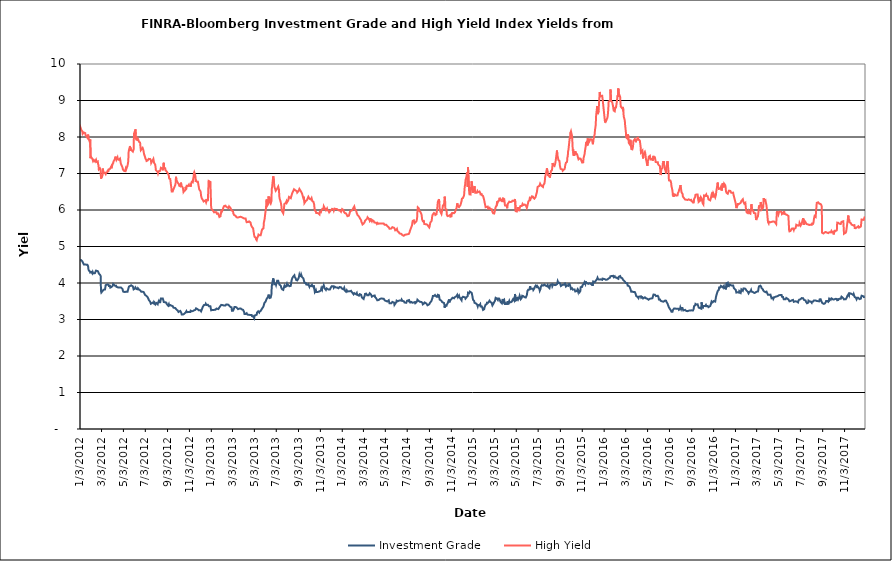
| Category | Investment Grade | High Yield |
|---|---|---|
| 1/3/12 | 4.624 | 8.216 |
| 1/4/12 | 4.644 | 8.259 |
| 1/5/12 | 4.644 | 8.232 |
| 1/6/12 | 4.626 | 8.199 |
| 1/9/12 | 4.59 | 8.152 |
| 1/10/12 | 4.585 | 8.087 |
| 1/11/12 | 4.55 | 8.061 |
| 1/12/12 | 4.527 | 8.108 |
| 1/13/12 | 4.51 | 8.124 |
| 1/17/12 | 4.51 | 8.108 |
| 1/18/12 | 4.485 | 8.052 |
| 1/19/12 | 4.488 | 8.052 |
| 1/20/12 | 4.503 | 8.047 |
| 1/23/12 | 4.499 | 7.982 |
| 1/24/12 | 4.515 | 7.979 |
| 1/25/12 | 4.463 | 8.067 |
| 1/26/12 | 4.377 | 8.005 |
| 1/27/12 | 4.344 | 7.944 |
| 1/30/12 | 4.318 | 7.856 |
| 1/31/12 | 4.288 | 7.93 |
| 2/1/12 | 4.311 | 7.42 |
| 2/2/12 | 4.283 | 7.458 |
| 2/3/12 | 4.302 | 7.45 |
| 2/6/12 | 4.261 | 7.402 |
| 2/7/12 | 4.294 | 7.41 |
| 2/8/12 | 4.264 | 7.338 |
| 2/9/12 | 4.292 | 7.322 |
| 2/10/12 | 4.28 | 7.37 |
| 2/13/12 | 4.27 | 7.333 |
| 2/14/12 | 4.268 | 7.355 |
| 2/15/12 | 4.272 | 7.348 |
| 2/16/12 | 4.34 | 7.377 |
| 2/17/12 | 4.318 | 7.315 |
| 2/21/12 | 4.326 | 7.333 |
| 2/22/12 | 4.307 | 7.259 |
| 2/23/12 | 4.289 | 7.23 |
| 2/24/12 | 4.256 | 7.113 |
| 2/27/12 | 4.227 | 7.141 |
| 2/28/12 | 4.205 | 7.128 |
| 2/29/12 | 4.196 | 7.087 |
| 3/1/12 | 3.782 | 6.859 |
| 3/2/12 | 3.739 | 6.877 |
| 3/5/12 | 3.776 | 6.946 |
| 3/6/12 | 3.792 | 7.137 |
| 3/7/12 | 3.798 | 7.084 |
| 3/8/12 | 3.816 | 7.085 |
| 3/9/12 | 3.829 | 7.01 |
| 3/12/12 | 3.82 | 7.02 |
| 3/13/12 | 3.866 | 7.002 |
| 3/14/12 | 3.94 | 6.987 |
| 3/15/12 | 3.944 | 7.022 |
| 3/16/12 | 3.939 | 7.01 |
| 3/19/12 | 3.961 | 7.042 |
| 3/20/12 | 3.981 | 7.089 |
| 3/21/12 | 3.94 | 7.051 |
| 3/22/12 | 3.95 | 7.109 |
| 3/23/12 | 3.919 | 7.133 |
| 3/26/12 | 3.924 | 7.127 |
| 3/27/12 | 3.874 | 7.107 |
| 3/28/12 | 3.883 | 7.113 |
| 3/29/12 | 3.883 | 7.181 |
| 3/30/12 | 3.888 | 7.142 |
| 4/2/12 | 3.914 | 7.257 |
| 4/3/12 | 3.93 | 7.25 |
| 4/4/12 | 3.973 | 7.286 |
| 4/5/12 | 3.958 | 7.331 |
| 4/9/12 | 3.923 | 7.398 |
| 4/10/12 | 3.915 | 7.462 |
| 4/11/12 | 3.932 | 7.466 |
| 4/12/12 | 3.927 | 7.411 |
| 4/13/12 | 3.896 | 7.375 |
| 4/16/12 | 3.885 | 7.44 |
| 4/17/12 | 3.895 | 7.391 |
| 4/18/12 | 3.887 | 7.378 |
| 4/19/12 | 3.875 | 7.389 |
| 4/20/12 | 3.891 | 7.374 |
| 4/23/12 | 3.88 | 7.407 |
| 4/24/12 | 3.89 | 7.354 |
| 4/25/12 | 3.902 | 7.283 |
| 4/26/12 | 3.877 | 7.261 |
| 4/27/12 | 3.859 | 7.23 |
| 4/30/12 | 3.838 | 7.166 |
| 5/1/12 | 3.79 | 7.111 |
| 5/2/12 | 3.763 | 7.089 |
| 5/3/12 | 3.753 | 7.084 |
| 5/4/12 | 3.741 | 7.073 |
| 5/7/12 | 3.754 | 7.065 |
| 5/8/12 | 3.736 | 7.096 |
| 5/9/12 | 3.758 | 7.133 |
| 5/10/12 | 3.764 | 7.106 |
| 5/11/12 | 3.753 | 7.114 |
| 5/14/12 | 3.761 | 7.218 |
| 5/15/12 | 3.777 | 7.243 |
| 5/16/12 | 3.834 | 7.333 |
| 5/17/12 | 3.87 | 7.578 |
| 5/18/12 | 3.902 | 7.646 |
| 5/21/12 | 3.917 | 7.752 |
| 5/22/12 | 3.933 | 7.622 |
| 5/23/12 | 3.918 | 7.682 |
| 5/24/12 | 3.937 | 7.672 |
| 5/25/12 | 3.915 | 7.64 |
| 5/29/12 | 3.905 | 7.602 |
| 5/30/12 | 3.862 | 7.632 |
| 5/31/12 | 3.826 | 7.662 |
| 6/1/12 | 3.818 | 8.092 |
| 6/4/12 | 3.85 | 8.17 |
| 6/5/12 | 3.878 | 8.21 |
| 6/6/12 | 3.886 | 8.066 |
| 6/7/12 | 3.856 | 7.931 |
| 6/8/12 | 3.836 | 7.933 |
| 6/11/12 | 3.828 | 7.914 |
| 6/12/12 | 3.856 | 7.949 |
| 6/13/12 | 3.86 | 7.943 |
| 6/14/12 | 3.863 | 7.942 |
| 6/15/12 | 3.821 | 7.87 |
| 6/18/12 | 3.8 | 7.848 |
| 6/19/12 | 3.803 | 7.732 |
| 6/20/12 | 3.792 | 7.639 |
| 6/21/12 | 3.763 | 7.625 |
| 6/22/12 | 3.773 | 7.65 |
| 6/25/12 | 3.762 | 7.701 |
| 6/26/12 | 3.776 | 7.674 |
| 6/27/12 | 3.768 | 7.646 |
| 6/28/12 | 3.751 | 7.632 |
| 6/29/12 | 3.757 | 7.535 |
| 7/2/12 | 3.673 | 7.447 |
| 7/3/12 | 3.66 | 7.406 |
| 7/5/12 | 3.651 | 7.378 |
| 7/6/12 | 3.629 | 7.342 |
| 7/9/12 | 3.611 | 7.357 |
| 7/10/12 | 3.588 | 7.354 |
| 7/11/12 | 3.572 | 7.34 |
| 7/12/12 | 3.541 | 7.402 |
| 7/13/12 | 3.535 | 7.388 |
| 7/16/12 | 3.487 | 7.396 |
| 7/17/12 | 3.48 | 7.399 |
| 7/18/12 | 3.431 | 7.363 |
| 7/19/12 | 3.418 | 7.288 |
| 7/20/12 | 3.447 | 7.314 |
| 7/23/12 | 3.462 | 7.359 |
| 7/24/12 | 3.448 | 7.378 |
| 7/25/12 | 3.445 | 7.399 |
| 7/26/12 | 3.44 | 7.346 |
| 7/27/12 | 3.483 | 7.292 |
| 7/30/12 | 3.45 | 7.246 |
| 7/31/12 | 3.416 | 7.184 |
| 8/1/12 | 3.428 | 7.092 |
| 8/2/12 | 3.414 | 7.106 |
| 8/3/12 | 3.45 | 7.088 |
| 8/6/12 | 3.418 | 7.041 |
| 8/7/12 | 3.461 | 7.003 |
| 8/8/12 | 3.479 | 7.034 |
| 8/9/12 | 3.504 | 7.035 |
| 8/10/12 | 3.473 | 7.07 |
| 8/13/12 | 3.471 | 7.073 |
| 8/14/12 | 3.518 | 7.074 |
| 8/15/12 | 3.575 | 7.155 |
| 8/16/12 | 3.592 | 7.161 |
| 8/17/12 | 3.585 | 7.148 |
| 8/20/12 | 3.578 | 7.123 |
| 8/21/12 | 3.57 | 7.089 |
| 8/22/12 | 3.519 | 7.077 |
| 8/23/12 | 3.479 | 7.292 |
| 8/24/12 | 3.488 | 7.141 |
| 8/27/12 | 3.472 | 7.141 |
| 8/28/12 | 3.462 | 7.084 |
| 8/29/12 | 3.479 | 7.101 |
| 8/30/12 | 3.462 | 7.07 |
| 8/31/12 | 3.429 | 7.058 |
| 9/4/12 | 3.381 | 6.991 |
| 9/5/12 | 3.393 | 6.999 |
| 9/6/12 | 3.42 | 6.945 |
| 9/7/12 | 3.379 | 6.864 |
| 9/10/12 | 3.397 | 6.85 |
| 9/11/12 | 3.389 | 6.773 |
| 9/12/12 | 3.394 | 6.683 |
| 9/13/12 | 3.38 | 6.624 |
| 9/14/12 | 3.386 | 6.506 |
| 9/17/12 | 3.365 | 6.507 |
| 9/18/12 | 3.349 | 6.545 |
| 9/19/12 | 3.325 | 6.538 |
| 9/20/12 | 3.34 | 6.588 |
| 9/21/12 | 3.334 | 6.594 |
| 9/24/12 | 3.314 | 6.685 |
| 9/25/12 | 3.315 | 6.734 |
| 9/26/12 | 3.304 | 6.91 |
| 9/27/12 | 3.28 | 6.846 |
| 9/28/12 | 3.261 | 6.81 |
| 10/1/12 | 3.242 | 6.745 |
| 10/2/12 | 3.225 | 6.758 |
| 10/3/12 | 3.206 | 6.729 |
| 10/4/12 | 3.198 | 6.708 |
| 10/5/12 | 3.217 | 6.665 |
| 10/8/12 | 3.234 | 6.651 |
| 10/9/12 | 3.211 | 6.699 |
| 10/10/12 | 3.215 | 6.75 |
| 10/11/12 | 3.18 | 6.673 |
| 10/12/12 | 3.137 | 6.659 |
| 10/15/12 | 3.135 | 6.614 |
| 10/16/12 | 3.134 | 6.56 |
| 10/17/12 | 3.131 | 6.493 |
| 10/18/12 | 3.149 | 6.482 |
| 10/19/12 | 3.16 | 6.522 |
| 10/22/12 | 3.183 | 6.536 |
| 10/23/12 | 3.201 | 6.636 |
| 10/24/12 | 3.205 | 6.564 |
| 10/25/12 | 3.228 | 6.597 |
| 10/26/12 | 3.2 | 6.662 |
| 10/29/12 | 3.203 | 6.656 |
| 10/30/12 | 3.206 | 6.657 |
| 10/31/12 | 3.18 | 6.676 |
| 11/1/12 | 3.205 | 6.697 |
| 11/2/12 | 3.215 | 6.665 |
| 11/5/12 | 3.207 | 6.673 |
| 11/6/12 | 3.241 | 6.638 |
| 11/7/12 | 3.226 | 6.716 |
| 11/8/12 | 3.223 | 6.722 |
| 11/9/12 | 3.226 | 6.772 |
| 11/12/12 | 3.231 | 6.76 |
| 11/13/12 | 3.234 | 6.859 |
| 11/14/12 | 3.234 | 6.896 |
| 11/15/12 | 3.248 | 7.004 |
| 11/16/12 | 3.256 | 7.034 |
| 11/19/12 | 3.264 | 6.942 |
| 11/20/12 | 3.279 | 6.776 |
| 11/21/12 | 3.306 | 6.812 |
| 11/23/12 | 3.3 | 6.777 |
| 11/26/12 | 3.276 | 6.775 |
| 11/27/12 | 3.269 | 6.718 |
| 11/28/12 | 3.258 | 6.697 |
| 11/29/12 | 3.25 | 6.607 |
| 11/30/12 | 3.244 | 6.561 |
| 12/3/12 | 3.252 | 6.521 |
| 12/4/12 | 3.247 | 6.486 |
| 12/5/12 | 3.223 | 6.392 |
| 12/6/12 | 3.219 | 6.372 |
| 12/7/12 | 3.243 | 6.317 |
| 12/10/12 | 3.35 | 6.272 |
| 12/11/12 | 3.362 | 6.245 |
| 12/12/12 | 3.371 | 6.232 |
| 12/13/12 | 3.396 | 6.227 |
| 12/14/12 | 3.383 | 6.224 |
| 12/17/12 | 3.403 | 6.265 |
| 12/18/12 | 3.431 | 6.248 |
| 12/19/12 | 3.404 | 6.208 |
| 12/20/12 | 3.399 | 6.227 |
| 12/21/12 | 3.382 | 6.275 |
| 12/24/12 | 3.403 | 6.269 |
| 12/26/12 | 3.377 | 6.796 |
| 12/27/12 | 3.36 | 6.778 |
| 12/28/12 | 3.343 | 6.772 |
| 12/31/12 | 3.362 | 6.769 |
| 1/2/13 | 3.253 | 6.097 |
| 1/3/13 | 3.262 | 6.031 |
| 1/4/13 | 3.275 | 6.009 |
| 1/7/13 | 3.263 | 5.989 |
| 1/8/13 | 3.254 | 5.982 |
| 1/9/13 | 3.254 | 5.981 |
| 1/10/13 | 3.263 | 5.936 |
| 1/11/13 | 3.269 | 5.922 |
| 1/14/13 | 3.266 | 5.942 |
| 1/15/13 | 3.27 | 5.969 |
| 1/16/13 | 3.27 | 5.969 |
| 1/17/13 | 3.3 | 5.937 |
| 1/18/13 | 3.291 | 5.899 |
| 1/22/13 | 3.284 | 5.903 |
| 1/23/13 | 3.277 | 5.86 |
| 1/24/13 | 3.294 | 5.846 |
| 1/25/13 | 3.332 | 5.809 |
| 1/28/13 | 3.372 | 5.827 |
| 1/29/13 | 3.379 | 5.889 |
| 1/30/13 | 3.401 | 5.942 |
| 1/31/13 | 3.394 | 6.003 |
| 2/1/13 | 3.393 | 5.96 |
| 2/4/13 | 3.392 | 6.024 |
| 2/5/13 | 3.412 | 6.065 |
| 2/6/13 | 3.397 | 6.086 |
| 2/7/13 | 3.382 | 6.107 |
| 2/8/13 | 3.395 | 6.111 |
| 2/11/13 | 3.385 | 6.118 |
| 2/12/13 | 3.399 | 6.096 |
| 2/13/13 | 3.412 | 6.09 |
| 2/14/13 | 3.398 | 6.075 |
| 2/15/13 | 3.402 | 6.08 |
| 2/19/13 | 3.405 | 6.055 |
| 2/20/13 | 3.406 | 6.039 |
| 2/21/13 | 3.382 | 6.101 |
| 2/22/13 | 3.373 | 6.085 |
| 2/25/13 | 3.342 | 6.054 |
| 2/26/13 | 3.328 | 6.07 |
| 2/27/13 | 3.332 | 6.052 |
| 2/28/13 | 3.335 | 5.988 |
| 3/1/13 | 3.239 | 5.98 |
| 3/4/13 | 3.242 | 5.966 |
| 3/5/13 | 3.255 | 5.902 |
| 3/6/13 | 3.279 | 5.894 |
| 3/7/13 | 3.308 | 5.863 |
| 3/8/13 | 3.345 | 5.861 |
| 3/11/13 | 3.345 | 5.841 |
| 3/12/13 | 3.32 | 5.826 |
| 3/13/13 | 3.327 | 5.822 |
| 3/14/13 | 3.328 | 5.799 |
| 3/15/13 | 3.305 | 5.794 |
| 3/18/13 | 3.284 | 5.795 |
| 3/19/13 | 3.26 | 5.788 |
| 3/20/13 | 3.291 | 5.81 |
| 3/21/13 | 3.296 | 5.805 |
| 3/22/13 | 3.302 | 5.8 |
| 3/25/13 | 3.303 | 5.814 |
| 3/26/13 | 3.312 | 5.815 |
| 3/27/13 | 3.283 | 5.806 |
| 3/28/13 | 3.28 | 5.806 |
| 4/1/13 | 3.264 | 5.782 |
| 4/2/13 | 3.274 | 5.776 |
| 4/3/13 | 3.242 | 5.781 |
| 4/4/13 | 3.202 | 5.769 |
| 4/5/13 | 3.149 | 5.775 |
| 4/8/13 | 3.151 | 5.769 |
| 4/9/13 | 3.146 | 5.733 |
| 4/10/13 | 3.17 | 5.712 |
| 4/11/13 | 3.172 | 5.667 |
| 4/12/13 | 3.142 | 5.651 |
| 4/15/13 | 3.128 | 5.669 |
| 4/16/13 | 3.134 | 5.653 |
| 4/17/13 | 3.128 | 5.675 |
| 4/18/13 | 3.127 | 5.689 |
| 4/19/13 | 3.135 | 5.67 |
| 4/22/13 | 3.126 | 5.653 |
| 4/23/13 | 3.117 | 5.6 |
| 4/24/13 | 3.105 | 5.569 |
| 4/25/13 | 3.125 | 5.572 |
| 4/26/13 | 3.092 | 5.534 |
| 4/29/13 | 3.087 | 5.499 |
| 4/30/13 | 3.086 | 5.43 |
| 5/1/13 | 3.067 | 5.368 |
| 5/2/13 | 3.036 | 5.305 |
| 5/3/13 | 3.109 | 5.266 |
| 5/6/13 | 3.117 | 5.244 |
| 5/7/13 | 3.136 | 5.201 |
| 5/8/13 | 3.129 | 5.184 |
| 5/9/13 | 3.131 | 5.173 |
| 5/10/13 | 3.19 | 5.221 |
| 5/13/13 | 3.224 | 5.288 |
| 5/14/13 | 3.228 | 5.326 |
| 5/15/13 | 3.223 | 5.334 |
| 5/16/13 | 3.19 | 5.306 |
| 5/17/13 | 3.218 | 5.305 |
| 5/20/13 | 3.234 | 5.306 |
| 5/21/13 | 3.229 | 5.314 |
| 5/22/13 | 3.258 | 5.327 |
| 5/23/13 | 3.284 | 5.429 |
| 5/24/13 | 3.284 | 5.465 |
| 5/28/13 | 3.36 | 5.504 |
| 5/29/13 | 3.404 | 5.657 |
| 5/30/13 | 3.413 | 5.675 |
| 5/31/13 | 3.463 | 5.748 |
| 6/3/13 | 3.494 | 5.995 |
| 6/4/13 | 3.522 | 6.063 |
| 6/5/13 | 3.552 | 6.239 |
| 6/6/13 | 3.551 | 6.291 |
| 6/7/13 | 3.57 | 6.113 |
| 6/10/13 | 3.628 | 6.164 |
| 6/11/13 | 3.681 | 6.371 |
| 6/12/13 | 3.674 | 6.305 |
| 6/13/13 | 3.66 | 6.359 |
| 6/14/13 | 3.588 | 6.227 |
| 6/17/13 | 3.599 | 6.175 |
| 6/18/13 | 3.646 | 6.192 |
| 6/19/13 | 3.69 | 6.237 |
| 6/20/13 | 3.91 | 6.572 |
| 6/21/13 | 3.967 | 6.634 |
| 6/24/13 | 4.127 | 6.924 |
| 6/25/13 | 4.1 | 6.906 |
| 6/26/13 | 4.034 | 6.807 |
| 6/27/13 | 3.965 | 6.661 |
| 6/28/13 | 3.948 | 6.621 |
| 7/1/13 | 3.98 | 6.527 |
| 7/2/13 | 3.946 | 6.515 |
| 7/3/13 | 3.938 | 6.511 |
| 7/5/13 | 4.063 | 6.58 |
| 7/8/13 | 4.062 | 6.64 |
| 7/9/13 | 4.028 | 6.597 |
| 7/10/13 | 4.031 | 6.565 |
| 7/11/13 | 3.96 | 6.376 |
| 7/12/13 | 3.939 | 6.31 |
| 7/15/13 | 3.925 | 6.216 |
| 7/16/13 | 3.898 | 6.158 |
| 7/17/13 | 3.86 | 6.1 |
| 7/18/13 | 3.855 | 5.979 |
| 7/19/13 | 3.825 | 5.96 |
| 7/22/13 | 3.811 | 5.908 |
| 7/23/13 | 3.816 | 5.902 |
| 7/24/13 | 3.884 | 6.035 |
| 7/25/13 | 3.915 | 6.163 |
| 7/26/13 | 3.885 | 6.171 |
| 7/29/13 | 3.902 | 6.194 |
| 7/30/13 | 3.908 | 6.189 |
| 7/31/13 | 3.941 | 6.239 |
| 8/1/13 | 3.969 | 6.199 |
| 8/2/13 | 3.925 | 6.226 |
| 8/5/13 | 3.944 | 6.265 |
| 8/6/13 | 3.953 | 6.313 |
| 8/7/13 | 3.934 | 6.358 |
| 8/8/13 | 3.913 | 6.344 |
| 8/9/13 | 3.916 | 6.347 |
| 8/12/13 | 3.923 | 6.324 |
| 8/13/13 | 4.006 | 6.362 |
| 8/14/13 | 4.018 | 6.359 |
| 8/15/13 | 4.099 | 6.426 |
| 8/16/13 | 4.129 | 6.46 |
| 8/19/13 | 4.18 | 6.522 |
| 8/20/13 | 4.155 | 6.544 |
| 8/21/13 | 4.183 | 6.569 |
| 8/22/13 | 4.211 | 6.583 |
| 8/23/13 | 4.166 | 6.552 |
| 8/26/13 | 4.123 | 6.531 |
| 8/27/13 | 4.082 | 6.547 |
| 8/28/13 | 4.096 | 6.551 |
| 8/29/13 | 4.092 | 6.517 |
| 8/30/13 | 4.071 | 6.478 |
| 9/3/13 | 4.136 | 6.523 |
| 9/4/13 | 4.142 | 6.53 |
| 9/5/13 | 4.228 | 6.578 |
| 9/6/13 | 4.2 | 6.565 |
| 9/9/13 | 4.187 | 6.515 |
| 9/10/13 | 4.229 | 6.522 |
| 9/11/13 | 4.208 | 6.505 |
| 9/12/13 | 4.17 | 6.461 |
| 9/13/13 | 4.184 | 6.455 |
| 9/16/13 | 4.128 | 6.326 |
| 9/17/13 | 4.134 | 6.364 |
| 9/18/13 | 4.104 | 6.315 |
| 9/19/13 | 4.011 | 6.189 |
| 9/20/13 | 4.008 | 6.188 |
| 9/23/13 | 3.998 | 6.249 |
| 9/24/13 | 3.96 | 6.231 |
| 9/25/13 | 3.94 | 6.257 |
| 9/26/13 | 3.957 | 6.271 |
| 9/27/13 | 3.951 | 6.297 |
| 9/30/13 | 3.97 | 6.364 |
| 10/1/13 | 3.942 | 6.375 |
| 10/2/13 | 3.916 | 6.359 |
| 10/3/13 | 3.897 | 6.31 |
| 10/4/13 | 3.925 | 6.295 |
| 10/7/13 | 3.916 | 6.288 |
| 10/8/13 | 3.924 | 6.308 |
| 10/9/13 | 3.938 | 6.326 |
| 10/10/13 | 3.948 | 6.286 |
| 10/11/13 | 3.91 | 6.244 |
| 10/14/13 | 3.897 | 6.226 |
| 10/15/13 | 3.933 | 6.22 |
| 10/16/13 | 3.91 | 6.161 |
| 10/17/13 | 3.823 | 6.063 |
| 10/18/13 | 3.753 | 5.992 |
| 10/21/13 | 3.801 | 5.954 |
| 10/22/13 | 3.751 | 5.916 |
| 10/23/13 | 3.738 | 5.926 |
| 10/24/13 | 3.757 | 5.93 |
| 10/25/13 | 3.752 | 5.918 |
| 10/28/13 | 3.76 | 5.906 |
| 10/29/13 | 3.759 | 5.89 |
| 10/30/13 | 3.742 | 5.891 |
| 10/31/13 | 3.771 | 5.876 |
| 11/1/13 | 3.795 | 5.951 |
| 11/4/13 | 3.796 | 5.939 |
| 11/5/13 | 3.844 | 5.976 |
| 11/6/13 | 3.827 | 5.962 |
| 11/7/13 | 3.813 | 5.955 |
| 11/8/13 | 3.899 | 6.033 |
| 11/11/13 | 3.894 | 6.024 |
| 11/12/13 | 3.936 | 6.103 |
| 11/13/13 | 3.906 | 6.126 |
| 11/14/13 | 3.856 | 6.076 |
| 11/15/13 | 3.848 | 6.045 |
| 11/18/13 | 3.809 | 5.992 |
| 11/19/13 | 3.825 | 6.008 |
| 11/20/13 | 3.853 | 6.015 |
| 11/21/13 | 3.879 | 6.04 |
| 11/22/13 | 3.847 | 5.999 |
| 11/25/13 | 3.821 | 5.98 |
| 11/26/13 | 3.799 | 5.977 |
| 11/27/13 | 3.816 | 5.936 |
| 11/29/13 | 3.822 | 5.927 |
| 12/2/13 | 3.881 | 5.994 |
| 12/3/13 | 3.869 | 5.992 |
| 12/4/13 | 3.91 | 6.015 |
| 12/5/13 | 3.928 | 6.031 |
| 12/6/13 | 3.927 | 6.016 |
| 12/9/13 | 3.91 | 6.018 |
| 12/10/13 | 3.87 | 5.984 |
| 12/11/13 | 3.872 | 5.997 |
| 12/12/13 | 3.9 | 6.039 |
| 12/13/13 | 3.895 | 6.03 |
| 12/16/13 | 3.878 | 6.026 |
| 12/17/13 | 3.858 | 6.027 |
| 12/18/13 | 3.859 | 6.033 |
| 12/19/13 | 3.878 | 6.024 |
| 12/20/13 | 3.856 | 6.016 |
| 12/23/13 | 3.857 | 5.993 |
| 12/24/13 | 3.875 | 5.996 |
| 12/26/13 | 3.89 | 5.991 |
| 12/27/13 | 3.903 | 5.977 |
| 12/30/13 | 3.883 | 5.95 |
| 12/31/13 | 3.873 | 5.948 |
| 1/2/14 | 3.844 | 6.025 |
| 1/3/14 | 3.842 | 6.009 |
| 1/6/14 | 3.825 | 5.995 |
| 1/7/14 | 3.818 | 5.951 |
| 1/8/14 | 3.87 | 5.943 |
| 1/9/14 | 3.864 | 5.942 |
| 1/10/14 | 3.79 | 5.914 |
| 1/13/14 | 3.762 | 5.905 |
| 1/14/14 | 3.784 | 5.909 |
| 1/15/14 | 3.803 | 5.867 |
| 1/16/14 | 3.78 | 5.861 |
| 1/17/14 | 3.766 | 5.831 |
| 1/21/14 | 3.774 | 5.843 |
| 1/22/14 | 3.801 | 5.829 |
| 1/23/14 | 3.784 | 5.857 |
| 1/24/14 | 3.772 | 5.948 |
| 1/27/14 | 3.786 | 5.982 |
| 1/28/14 | 3.782 | 5.991 |
| 1/29/14 | 3.754 | 6.003 |
| 1/30/14 | 3.748 | 5.991 |
| 1/31/14 | 3.738 | 6.016 |
| 2/3/14 | 3.69 | 6.066 |
| 2/4/14 | 3.699 | 6.082 |
| 2/5/14 | 3.722 | 6.098 |
| 2/6/14 | 3.728 | 6.079 |
| 2/7/14 | 3.695 | 6.015 |
| 2/10/14 | 3.691 | 5.986 |
| 2/11/14 | 3.713 | 5.962 |
| 2/12/14 | 3.724 | 5.911 |
| 2/13/14 | 3.68 | 5.9 |
| 2/14/14 | 3.672 | 5.865 |
| 2/18/14 | 3.652 | 5.821 |
| 2/19/14 | 3.651 | 5.805 |
| 2/20/14 | 3.695 | 5.797 |
| 2/21/14 | 3.681 | 5.767 |
| 2/24/14 | 3.677 | 5.721 |
| 2/25/14 | 3.637 | 5.673 |
| 2/26/14 | 3.618 | 5.653 |
| 2/27/14 | 3.595 | 5.636 |
| 2/28/14 | 3.598 | 5.604 |
| 3/3/14 | 3.563 | 5.628 |
| 3/4/14 | 3.601 | 5.616 |
| 3/5/14 | 3.613 | 5.618 |
| 3/6/14 | 3.649 | 5.671 |
| 3/7/14 | 3.701 | 5.709 |
| 3/10/14 | 3.709 | 5.736 |
| 3/11/14 | 3.709 | 5.734 |
| 3/12/14 | 3.691 | 5.747 |
| 3/13/14 | 3.664 | 5.765 |
| 3/14/14 | 3.655 | 5.799 |
| 3/17/14 | 3.663 | 5.765 |
| 3/18/14 | 3.661 | 5.749 |
| 3/19/14 | 3.675 | 5.728 |
| 3/20/14 | 3.72 | 5.777 |
| 3/21/14 | 3.695 | 5.705 |
| 3/24/14 | 3.678 | 5.735 |
| 3/25/14 | 3.669 | 5.735 |
| 3/26/14 | 3.626 | 5.694 |
| 3/27/14 | 3.629 | 5.724 |
| 3/28/14 | 3.647 | 5.698 |
| 3/31/14 | 3.652 | 5.7 |
| 4/1/14 | 3.641 | 5.714 |
| 4/2/14 | 3.676 | 5.658 |
| 4/3/14 | 3.658 | 5.653 |
| 4/4/14 | 3.612 | 5.634 |
| 4/7/14 | 3.582 | 5.65 |
| 4/8/14 | 3.577 | 5.642 |
| 4/9/14 | 3.572 | 5.618 |
| 4/10/14 | 3.527 | 5.604 |
| 4/11/14 | 3.519 | 5.647 |
| 4/14/14 | 3.533 | 5.622 |
| 4/15/14 | 3.529 | 5.639 |
| 4/16/14 | 3.534 | 5.633 |
| 4/17/14 | 3.562 | 5.633 |
| 4/21/14 | 3.574 | 5.631 |
| 4/22/14 | 3.588 | 5.628 |
| 4/23/14 | 3.564 | 5.628 |
| 4/24/14 | 3.572 | 5.628 |
| 4/25/14 | 3.554 | 5.625 |
| 4/28/14 | 3.568 | 5.63 |
| 4/29/14 | 3.582 | 5.617 |
| 4/30/14 | 3.551 | 5.598 |
| 5/1/14 | 3.522 | 5.612 |
| 5/2/14 | 3.506 | 5.584 |
| 5/5/14 | 3.507 | 5.594 |
| 5/6/14 | 3.51 | 5.583 |
| 5/7/14 | 3.506 | 5.579 |
| 5/8/14 | 3.493 | 5.562 |
| 5/9/14 | 3.498 | 5.534 |
| 5/12/14 | 3.526 | 5.525 |
| 5/13/14 | 3.501 | 5.514 |
| 5/14/14 | 3.446 | 5.488 |
| 5/15/14 | 3.426 | 5.499 |
| 5/16/14 | 3.439 | 5.512 |
| 5/19/14 | 3.443 | 5.491 |
| 5/20/14 | 3.448 | 5.508 |
| 5/21/14 | 3.47 | 5.5 |
| 5/22/14 | 3.482 | 5.53 |
| 5/23/14 | 3.463 | 5.526 |
| 5/27/14 | 3.462 | 5.512 |
| 5/28/14 | 3.401 | 5.487 |
| 5/29/14 | 3.398 | 5.479 |
| 5/30/14 | 3.421 | 5.443 |
| 6/2/14 | 3.475 | 5.453 |
| 6/3/14 | 3.517 | 5.48 |
| 6/4/14 | 3.528 | 5.481 |
| 6/5/14 | 3.519 | 5.441 |
| 6/6/14 | 3.499 | 5.411 |
| 6/9/14 | 3.513 | 5.394 |
| 6/10/14 | 3.532 | 5.381 |
| 6/11/14 | 3.523 | 5.359 |
| 6/12/14 | 3.523 | 5.362 |
| 6/13/14 | 3.519 | 5.366 |
| 6/16/14 | 3.516 | 5.346 |
| 6/17/14 | 3.546 | 5.364 |
| 6/18/14 | 3.533 | 5.363 |
| 6/19/14 | 3.511 | 5.314 |
| 6/20/14 | 3.523 | 5.304 |
| 6/23/14 | 3.501 | 5.294 |
| 6/24/14 | 3.494 | 5.293 |
| 6/25/14 | 3.465 | 5.304 |
| 6/26/14 | 3.453 | 5.321 |
| 6/27/14 | 3.457 | 5.324 |
| 6/30/14 | 3.458 | 5.329 |
| 7/1/14 | 3.475 | 5.317 |
| 7/2/14 | 3.514 | 5.332 |
| 7/3/14 | 3.538 | 5.336 |
| 7/7/14 | 3.53 | 5.343 |
| 7/8/14 | 3.473 | 5.364 |
| 7/9/14 | 3.502 | 5.384 |
| 7/10/14 | 3.481 | 5.427 |
| 7/11/14 | 3.466 | 5.431 |
| 7/14/14 | 3.482 | 5.531 |
| 7/15/14 | 3.497 | 5.553 |
| 7/16/14 | 3.49 | 5.582 |
| 7/17/14 | 3.459 | 5.665 |
| 7/18/14 | 3.469 | 5.704 |
| 7/21/14 | 3.467 | 5.719 |
| 7/22/14 | 3.458 | 5.682 |
| 7/23/14 | 3.443 | 5.641 |
| 7/24/14 | 3.478 | 5.654 |
| 7/25/14 | 3.446 | 5.658 |
| 7/28/14 | 3.469 | 5.688 |
| 7/29/14 | 3.455 | 5.7 |
| 7/30/14 | 3.506 | 5.764 |
| 7/31/14 | 3.543 | 5.968 |
| 8/1/14 | 3.525 | 6.073 |
| 8/4/14 | 3.505 | 6.045 |
| 8/5/14 | 3.517 | 5.981 |
| 8/6/14 | 3.51 | 5.994 |
| 8/7/14 | 3.485 | 5.965 |
| 8/8/14 | 3.464 | 5.953 |
| 8/11/14 | 3.48 | 5.889 |
| 8/12/14 | 3.494 | 5.843 |
| 8/13/14 | 3.476 | 5.746 |
| 8/14/14 | 3.454 | 5.721 |
| 8/15/14 | 3.415 | 5.695 |
| 8/18/14 | 3.436 | 5.699 |
| 8/19/14 | 3.443 | 5.618 |
| 8/20/14 | 3.467 | 5.635 |
| 8/21/14 | 3.456 | 5.605 |
| 8/22/14 | 3.449 | 5.612 |
| 8/25/14 | 3.437 | 5.607 |
| 8/26/14 | 3.427 | 5.585 |
| 8/27/14 | 3.422 | 5.589 |
| 8/28/14 | 3.39 | 5.591 |
| 8/29/14 | 3.388 | 5.58 |
| 9/2/14 | 3.417 | 5.521 |
| 9/3/14 | 3.422 | 5.55 |
| 9/4/14 | 3.455 | 5.611 |
| 9/5/14 | 3.442 | 5.659 |
| 9/8/14 | 3.508 | 5.69 |
| 9/9/14 | 3.502 | 5.725 |
| 9/10/14 | 3.526 | 5.811 |
| 9/11/14 | 3.592 | 5.863 |
| 9/12/14 | 3.644 | 5.879 |
| 9/15/14 | 3.645 | 5.918 |
| 9/16/14 | 3.638 | 5.941 |
| 9/17/14 | 3.642 | 5.916 |
| 9/18/14 | 3.672 | 5.895 |
| 9/19/14 | 3.648 | 5.863 |
| 9/22/14 | 3.624 | 5.882 |
| 9/23/14 | 3.611 | 5.959 |
| 9/24/14 | 3.634 | 6.004 |
| 9/25/14 | 3.622 | 6.133 |
| 9/26/14 | 3.675 | 6.226 |
| 9/29/14 | 3.665 | 6.297 |
| 9/30/14 | 3.666 | 6.198 |
| 10/1/14 | 3.546 | 6.041 |
| 10/2/14 | 3.543 | 6.033 |
| 10/3/14 | 3.562 | 5.951 |
| 10/6/14 | 3.511 | 5.891 |
| 10/7/14 | 3.49 | 5.942 |
| 10/8/14 | 3.476 | 5.966 |
| 10/9/14 | 3.455 | 6.047 |
| 10/10/14 | 3.455 | 6.125 |
| 10/13/14 | 3.455 | 6.126 |
| 10/14/14 | 3.415 | 6.254 |
| 10/15/14 | 3.322 | 6.366 |
| 10/16/14 | 3.392 | 6.295 |
| 10/17/14 | 3.405 | 6.024 |
| 10/20/14 | 3.378 | 6.011 |
| 10/21/14 | 3.408 | 5.869 |
| 10/22/14 | 3.423 | 5.856 |
| 10/23/14 | 3.438 | 5.833 |
| 10/24/14 | 3.46 | 5.826 |
| 10/27/14 | 3.549 | 5.844 |
| 10/28/14 | 3.47 | 5.831 |
| 10/29/14 | 3.508 | 5.854 |
| 10/30/14 | 3.484 | 5.863 |
| 10/31/14 | 3.523 | 5.818 |
| 11/3/14 | 3.563 | 5.828 |
| 11/4/14 | 3.561 | 5.914 |
| 11/5/14 | 3.58 | 5.896 |
| 11/6/14 | 3.597 | 5.904 |
| 11/7/14 | 3.571 | 5.919 |
| 11/10/14 | 3.581 | 5.911 |
| 11/11/14 | 3.58 | 5.894 |
| 11/12/14 | 3.61 | 5.917 |
| 11/13/14 | 3.63 | 5.944 |
| 11/14/14 | 3.622 | 5.986 |
| 11/17/14 | 3.639 | 6.05 |
| 11/18/14 | 3.664 | 6.114 |
| 11/19/14 | 3.676 | 6.183 |
| 11/20/14 | 3.645 | 6.193 |
| 11/21/14 | 3.61 | 6.102 |
| 11/24/14 | 3.655 | 6.077 |
| 11/25/14 | 3.614 | 6.062 |
| 11/26/14 | 3.592 | 6.055 |
| 11/28/14 | 3.571 | 6.136 |
| 12/1/14 | 3.527 | 6.244 |
| 12/2/14 | 3.592 | 6.31 |
| 12/3/14 | 3.6 | 6.3 |
| 12/4/14 | 3.583 | 6.311 |
| 12/5/14 | 3.624 | 6.33 |
| 12/8/14 | 3.613 | 6.401 |
| 12/9/14 | 3.596 | 6.533 |
| 12/10/14 | 3.594 | 6.652 |
| 12/11/14 | 3.607 | 6.697 |
| 12/12/14 | 3.574 | 6.816 |
| 12/15/14 | 3.61 | 6.93 |
| 12/16/14 | 3.622 | 7.031 |
| 12/17/14 | 3.611 | 6.874 |
| 12/18/14 | 3.64 | 6.631 |
| 12/19/14 | 3.733 | 7.172 |
| 12/22/14 | 3.718 | 6.524 |
| 12/23/14 | 3.739 | 6.429 |
| 12/24/14 | 3.766 | 6.426 |
| 12/26/14 | 3.758 | 6.424 |
| 12/29/14 | 3.733 | 6.787 |
| 12/30/14 | 3.701 | 6.803 |
| 12/31/14 | 3.703 | 6.802 |
| 1/2/15 | 3.539 | 6.473 |
| 1/5/15 | 3.512 | 6.579 |
| 1/6/15 | 3.46 | 6.653 |
| 1/7/15 | 3.461 | 6.584 |
| 1/8/15 | 3.475 | 6.473 |
| 1/9/15 | 3.446 | 6.454 |
| 1/12/15 | 3.428 | 6.47 |
| 1/13/15 | 3.418 | 6.483 |
| 1/14/15 | 3.39 | 6.514 |
| 1/15/15 | 3.36 | 6.485 |
| 1/16/15 | 3.398 | 6.499 |
| 1/20/15 | 3.388 | 6.507 |
| 1/21/15 | 3.406 | 6.501 |
| 1/22/15 | 3.418 | 6.465 |
| 1/23/15 | 3.358 | 6.428 |
| 1/26/15 | 3.361 | 6.434 |
| 1/27/15 | 3.345 | 6.403 |
| 1/28/15 | 3.321 | 6.38 |
| 1/29/15 | 3.327 | 6.384 |
| 1/30/15 | 3.263 | 6.383 |
| 2/2/15 | 3.283 | 6.276 |
| 2/3/15 | 3.33 | 6.218 |
| 2/4/15 | 3.356 | 6.175 |
| 2/5/15 | 3.339 | 6.128 |
| 2/6/15 | 3.407 | 6.077 |
| 2/9/15 | 3.421 | 6.086 |
| 2/10/15 | 3.462 | 6.091 |
| 2/11/15 | 3.47 | 6.106 |
| 2/12/15 | 3.453 | 6.094 |
| 2/13/15 | 3.458 | 6.04 |
| 2/17/15 | 3.516 | 6.061 |
| 2/18/15 | 3.496 | 6.032 |
| 2/19/15 | 3.481 | 6.045 |
| 2/20/15 | 3.471 | 6.044 |
| 2/23/15 | 3.46 | 6.021 |
| 2/24/15 | 3.413 | 5.985 |
| 2/25/15 | 3.385 | 5.95 |
| 2/26/15 | 3.409 | 5.923 |
| 2/27/15 | 3.418 | 5.91 |
| 3/2/15 | 3.477 | 5.903 |
| 3/3/15 | 3.496 | 5.943 |
| 3/4/15 | 3.51 | 5.991 |
| 3/5/15 | 3.501 | 6 |
| 3/6/15 | 3.594 | 6.079 |
| 3/9/15 | 3.577 | 6.134 |
| 3/10/15 | 3.55 | 6.235 |
| 3/11/15 | 3.562 | 6.188 |
| 3/12/15 | 3.536 | 6.163 |
| 3/13/15 | 3.575 | 6.241 |
| 3/16/15 | 3.572 | 6.268 |
| 3/17/15 | 3.575 | 6.335 |
| 3/18/15 | 3.525 | 6.323 |
| 3/19/15 | 3.502 | 6.265 |
| 3/20/15 | 3.473 | 6.273 |
| 3/23/15 | 3.447 | 6.285 |
| 3/24/15 | 3.422 | 6.276 |
| 3/25/15 | 3.437 | 6.217 |
| 3/26/15 | 3.564 | 6.235 |
| 3/27/15 | 3.474 | 6.318 |
| 3/30/15 | 3.526 | 6.299 |
| 3/31/15 | 3.507 | 6.274 |
| 4/1/15 | 3.404 | 6.124 |
| 4/2/15 | 3.449 | 6.142 |
| 4/6/15 | 3.44 | 6.113 |
| 4/7/15 | 3.404 | 6.048 |
| 4/8/15 | 3.398 | 6.153 |
| 4/9/15 | 3.501 | 6.166 |
| 4/10/15 | 3.417 | 6.184 |
| 4/13/15 | 3.504 | 6.228 |
| 4/14/15 | 3.471 | 6.226 |
| 4/15/15 | 3.473 | 6.219 |
| 4/16/15 | 3.484 | 6.218 |
| 4/17/15 | 3.473 | 6.234 |
| 4/20/15 | 3.489 | 6.228 |
| 4/21/15 | 3.492 | 6.234 |
| 4/22/15 | 3.533 | 6.256 |
| 4/23/15 | 3.533 | 6.264 |
| 4/24/15 | 3.564 | 6.251 |
| 4/27/15 | 3.515 | 6.246 |
| 4/28/15 | 3.552 | 6.264 |
| 4/29/15 | 3.699 | 6.302 |
| 4/30/15 | 3.726 | 6.285 |
| 5/1/15 | 3.52 | 5.968 |
| 5/4/15 | 3.534 | 5.958 |
| 5/5/15 | 3.574 | 5.972 |
| 5/6/15 | 3.62 | 6.006 |
| 5/7/15 | 3.605 | 6.081 |
| 5/8/15 | 3.55 | 5.995 |
| 5/11/15 | 3.609 | 5.99 |
| 5/12/15 | 3.65 | 6.054 |
| 5/13/15 | 3.637 | 6.048 |
| 5/14/15 | 3.622 | 6.108 |
| 5/15/15 | 3.557 | 6.102 |
| 5/18/15 | 3.6 | 6.112 |
| 5/19/15 | 3.651 | 6.136 |
| 5/20/15 | 3.661 | 6.167 |
| 5/21/15 | 3.638 | 6.158 |
| 5/22/15 | 3.64 | 6.136 |
| 5/26/15 | 3.609 | 6.149 |
| 5/27/15 | 3.605 | 6.158 |
| 5/28/15 | 3.609 | 6.154 |
| 5/29/15 | 3.603 | 6.129 |
| 6/1/15 | 3.671 | 6.055 |
| 6/2/15 | 3.74 | 6.084 |
| 6/3/15 | 3.79 | 6.139 |
| 6/4/15 | 3.77 | 6.173 |
| 6/5/15 | 3.818 | 6.229 |
| 6/8/15 | 3.819 | 6.264 |
| 6/9/15 | 3.86 | 6.317 |
| 6/10/15 | 3.91 | 6.341 |
| 6/11/15 | 3.87 | 6.29 |
| 6/12/15 | 3.84 | 6.32 |
| 6/15/15 | 3.842 | 6.375 |
| 6/16/15 | 3.839 | 6.396 |
| 6/17/15 | 3.856 | 6.39 |
| 6/18/15 | 3.846 | 6.365 |
| 6/19/15 | 3.809 | 6.333 |
| 6/22/15 | 3.854 | 6.31 |
| 6/23/15 | 3.886 | 6.314 |
| 6/24/15 | 3.89 | 6.335 |
| 6/25/15 | 3.906 | 6.351 |
| 6/26/15 | 3.933 | 6.383 |
| 6/29/15 | 3.911 | 6.493 |
| 6/30/15 | 3.862 | 6.48 |
| 7/1/15 | 3.903 | 6.633 |
| 7/2/15 | 3.879 | 6.623 |
| 7/6/15 | 3.834 | 6.661 |
| 7/7/15 | 3.788 | 6.691 |
| 7/8/15 | 3.79 | 6.722 |
| 7/9/15 | 3.833 | 6.699 |
| 7/10/15 | 3.898 | 6.684 |
| 7/13/15 | 3.945 | 6.654 |
| 7/14/15 | 3.962 | 6.658 |
| 7/15/15 | 3.941 | 6.639 |
| 7/16/15 | 3.928 | 6.631 |
| 7/17/15 | 3.92 | 6.684 |
| 7/20/15 | 3.957 | 6.728 |
| 7/21/15 | 3.946 | 6.789 |
| 7/22/15 | 3.931 | 6.902 |
| 7/23/15 | 3.927 | 6.942 |
| 7/24/15 | 3.914 | 6.987 |
| 7/27/15 | 3.912 | 7.142 |
| 7/28/15 | 3.92 | 7.122 |
| 7/29/15 | 3.945 | 7.014 |
| 7/30/15 | 3.937 | 6.955 |
| 7/31/15 | 3.891 | 6.938 |
| 8/3/15 | 3.859 | 6.92 |
| 8/4/15 | 3.885 | 6.888 |
| 8/5/15 | 3.946 | 6.932 |
| 8/6/15 | 3.943 | 6.967 |
| 8/7/15 | 3.927 | 7.062 |
| 8/10/15 | 3.964 | 7.093 |
| 8/11/15 | 3.914 | 7.18 |
| 8/12/15 | 3.922 | 7.288 |
| 8/13/15 | 3.961 | 7.23 |
| 8/14/15 | 3.966 | 7.205 |
| 8/17/15 | 3.946 | 7.205 |
| 8/18/15 | 3.964 | 7.21 |
| 8/19/15 | 3.97 | 7.268 |
| 8/20/15 | 3.942 | 7.329 |
| 8/21/15 | 3.932 | 7.397 |
| 8/24/15 | 3.969 | 7.631 |
| 8/25/15 | 4.004 | 7.506 |
| 8/26/15 | 4.048 | 7.509 |
| 8/27/15 | 4.024 | 7.42 |
| 8/28/15 | 3.999 | 7.369 |
| 8/31/15 | 4.006 | 7.34 |
| 9/1/15 | 3.984 | 7.221 |
| 9/2/15 | 3.974 | 7.211 |
| 9/3/15 | 3.949 | 7.128 |
| 9/4/15 | 3.918 | 7.154 |
| 9/8/15 | 3.947 | 7.11 |
| 9/9/15 | 3.956 | 7.075 |
| 9/10/15 | 3.97 | 7.101 |
| 9/11/15 | 3.954 | 7.087 |
| 9/14/15 | 3.96 | 7.121 |
| 9/15/15 | 4.007 | 7.156 |
| 9/16/15 | 4.028 | 7.23 |
| 9/17/15 | 3.993 | 7.256 |
| 9/18/15 | 3.906 | 7.296 |
| 9/21/15 | 3.934 | 7.32 |
| 9/22/15 | 3.908 | 7.44 |
| 9/23/15 | 3.928 | 7.47 |
| 9/24/15 | 3.924 | 7.602 |
| 9/25/15 | 3.968 | 7.65 |
| 9/28/15 | 3.972 | 7.936 |
| 9/29/15 | 3.972 | 8.01 |
| 9/30/15 | 3.965 | 7.959 |
| 10/1/15 | 3.884 | 8.129 |
| 10/2/15 | 3.839 | 8.158 |
| 10/5/15 | 3.857 | 8.024 |
| 10/6/15 | 3.84 | 7.851 |
| 10/7/15 | 3.818 | 7.629 |
| 10/8/15 | 3.812 | 7.659 |
| 10/9/15 | 3.837 | 7.508 |
| 10/12/15 | 3.824 | 7.508 |
| 10/13/15 | 3.812 | 7.563 |
| 10/14/15 | 3.768 | 7.61 |
| 10/15/15 | 3.779 | 7.616 |
| 10/16/15 | 3.788 | 7.538 |
| 10/19/15 | 3.785 | 7.528 |
| 10/20/15 | 3.814 | 7.497 |
| 10/21/15 | 3.788 | 7.455 |
| 10/22/15 | 3.753 | 7.473 |
| 10/23/15 | 3.796 | 7.388 |
| 10/26/15 | 3.747 | 7.413 |
| 10/27/15 | 3.743 | 7.438 |
| 10/28/15 | 3.777 | 7.418 |
| 10/29/15 | 3.886 | 7.404 |
| 10/30/15 | 3.896 | 7.394 |
| 11/2/15 | 3.894 | 7.301 |
| 11/3/15 | 3.935 | 7.298 |
| 11/4/15 | 3.959 | 7.279 |
| 11/5/15 | 3.956 | 7.305 |
| 11/6/15 | 3.965 | 7.419 |
| 11/9/15 | 4.026 | 7.539 |
| 11/10/15 | 4.023 | 7.622 |
| 11/11/15 | 3.98 | 7.598 |
| 11/12/15 | 4.043 | 7.738 |
| 11/13/15 | 4.012 | 7.843 |
| 11/16/15 | 3.995 | 7.878 |
| 11/17/15 | 4.004 | 7.77 |
| 11/18/15 | 4.007 | 7.96 |
| 11/19/15 | 3.976 | 7.826 |
| 11/20/15 | 3.983 | 7.817 |
| 11/23/15 | 3.992 | 7.892 |
| 11/24/15 | 3.987 | 7.94 |
| 11/25/15 | 3.985 | 7.947 |
| 11/27/15 | 3.969 | 7.941 |
| 11/30/15 | 3.988 | 7.921 |
| 12/1/15 | 3.922 | 7.843 |
| 12/2/15 | 3.941 | 7.803 |
| 12/3/15 | 4.042 | 7.88 |
| 12/4/15 | 4.027 | 7.946 |
| 12/7/15 | 4.02 | 8.079 |
| 12/8/15 | 4.022 | 8.196 |
| 12/9/15 | 4.049 | 8.261 |
| 12/10/15 | 4.07 | 8.336 |
| 12/11/15 | 4.029 | 8.573 |
| 12/14/15 | 4.113 | 8.851 |
| 12/15/15 | 4.144 | 8.708 |
| 12/16/15 | 4.149 | 8.625 |
| 12/17/15 | 4.1 | 8.603 |
| 12/18/15 | 4.089 | 8.721 |
| 12/21/15 | 4.094 | 9.233 |
| 12/22/15 | 4.106 | 9.187 |
| 12/23/15 | 4.112 | 9.11 |
| 12/24/15 | 4.101 | 9.094 |
| 12/28/15 | 4.087 | 9.127 |
| 12/29/15 | 4.12 | 9.054 |
| 12/30/15 | 4.125 | 9.036 |
| 12/31/15 | 4.104 | 9.06 |
| 1/4/16 | 4.106 | 8.484 |
| 1/5/16 | 4.12 | 8.399 |
| 1/6/16 | 4.084 | 8.412 |
| 1/7/16 | 4.09 | 8.486 |
| 1/8/16 | 4.067 | 8.446 |
| 1/11/16 | 4.093 | 8.512 |
| 1/12/16 | 4.085 | 8.549 |
| 1/13/16 | 4.082 | 8.64 |
| 1/14/16 | 4.118 | 8.769 |
| 1/15/16 | 4.122 | 8.973 |
| 1/19/16 | 4.149 | 8.988 |
| 1/20/16 | 4.186 | 9.301 |
| 1/21/16 | 4.177 | 9.211 |
| 1/22/16 | 4.196 | 8.98 |
| 1/25/16 | 4.194 | 8.955 |
| 1/26/16 | 4.187 | 8.894 |
| 1/27/16 | 4.214 | 8.863 |
| 1/28/16 | 4.196 | 8.783 |
| 1/29/16 | 4.16 | 8.725 |
| 2/1/16 | 4.182 | 8.703 |
| 2/2/16 | 4.154 | 8.78 |
| 2/3/16 | 4.156 | 8.825 |
| 2/4/16 | 4.15 | 8.793 |
| 2/5/16 | 4.151 | 8.837 |
| 2/8/16 | 4.131 | 9.058 |
| 2/9/16 | 4.149 | 9.143 |
| 2/10/16 | 4.131 | 9.094 |
| 2/11/16 | 4.116 | 9.329 |
| 2/12/16 | 4.171 | 9.21 |
| 2/16/16 | 4.192 | 9.095 |
| 2/17/16 | 4.208 | 8.915 |
| 2/18/16 | 4.15 | 8.831 |
| 2/19/16 | 4.138 | 8.84 |
| 2/22/16 | 4.13 | 8.781 |
| 2/23/16 | 4.106 | 8.783 |
| 2/24/16 | 4.09 | 8.824 |
| 2/25/16 | 4.064 | 8.702 |
| 2/26/16 | 4.072 | 8.564 |
| 2/29/16 | 4.042 | 8.449 |
| 3/1/16 | 4.025 | 8.321 |
| 3/2/16 | 4.029 | 8.227 |
| 3/3/16 | 3.997 | 8.131 |
| 3/4/16 | 4.002 | 7.988 |
| 3/7/16 | 3.992 | 7.96 |
| 3/8/16 | 3.928 | 8.028 |
| 3/9/16 | 3.943 | 8.071 |
| 3/10/16 | 3.949 | 8.015 |
| 3/11/16 | 3.918 | 7.839 |
| 3/14/16 | 3.887 | 7.796 |
| 3/15/16 | 3.911 | 7.883 |
| 3/16/16 | 3.862 | 7.924 |
| 3/17/16 | 3.796 | 7.778 |
| 3/18/16 | 3.762 | 7.673 |
| 3/21/16 | 3.765 | 7.661 |
| 3/22/16 | 3.763 | 7.696 |
| 3/23/16 | 3.743 | 7.751 |
| 3/24/16 | 3.75 | 7.891 |
| 3/28/16 | 3.751 | 7.945 |
| 3/29/16 | 3.724 | 7.962 |
| 3/30/16 | 3.707 | 7.915 |
| 3/31/16 | 3.668 | 7.857 |
| 4/1/16 | 3.64 | 7.924 |
| 4/4/16 | 3.626 | 7.932 |
| 4/5/16 | 3.6 | 8.003 |
| 4/6/16 | 3.616 | 7.948 |
| 4/7/16 | 3.587 | 7.964 |
| 4/8/16 | 3.623 | 7.931 |
| 4/11/16 | 3.629 | 7.898 |
| 4/12/16 | 3.648 | 7.816 |
| 4/13/16 | 3.636 | 7.75 |
| 4/14/16 | 3.636 | 7.578 |
| 4/15/16 | 3.596 | 7.599 |
| 4/18/16 | 3.611 | 7.627 |
| 4/19/16 | 3.584 | 7.493 |
| 4/20/16 | 3.577 | 7.413 |
| 4/21/16 | 3.601 | 7.525 |
| 4/22/16 | 3.602 | 7.509 |
| 4/25/16 | 3.608 | 7.592 |
| 4/26/16 | 3.633 | 7.556 |
| 4/27/16 | 3.611 | 7.481 |
| 4/28/16 | 3.58 | 7.395 |
| 4/29/16 | 3.567 | 7.393 |
| 5/2/16 | 3.567 | 7.211 |
| 5/3/16 | 3.545 | 7.322 |
| 5/4/16 | 3.56 | 7.364 |
| 5/5/16 | 3.542 | 7.403 |
| 5/6/16 | 3.562 | 7.461 |
| 5/9/16 | 3.568 | 7.485 |
| 5/10/16 | 3.562 | 7.463 |
| 5/11/16 | 3.554 | 7.385 |
| 5/12/16 | 3.575 | 7.4 |
| 5/13/16 | 3.564 | 7.402 |
| 5/16/16 | 3.583 | 7.399 |
| 5/17/16 | 3.587 | 7.35 |
| 5/18/16 | 3.653 | 7.369 |
| 5/19/16 | 3.683 | 7.483 |
| 5/20/16 | 3.682 | 7.418 |
| 5/23/16 | 3.68 | 7.433 |
| 5/24/16 | 3.695 | 7.39 |
| 5/25/16 | 3.68 | 7.313 |
| 5/26/16 | 3.641 | 7.301 |
| 5/27/16 | 3.632 | 7.293 |
| 5/31/16 | 3.649 | 7.308 |
| 6/1/16 | 3.638 | 7.247 |
| 6/2/16 | 3.613 | 7.269 |
| 6/3/16 | 3.549 | 7.242 |
| 6/6/16 | 3.55 | 7.2 |
| 6/7/16 | 3.53 | 7.058 |
| 6/8/16 | 3.512 | 6.957 |
| 6/9/16 | 3.494 | 7.046 |
| 6/10/16 | 3.491 | 7.112 |
| 6/13/16 | 3.493 | 7.16 |
| 6/14/16 | 3.513 | 7.288 |
| 6/15/16 | 3.501 | 7.256 |
| 6/16/16 | 3.489 | 7.342 |
| 6/17/16 | 3.503 | 7.262 |
| 6/20/16 | 3.518 | 7.114 |
| 6/21/16 | 3.523 | 7.133 |
| 6/22/16 | 3.512 | 7.061 |
| 6/23/16 | 3.517 | 7 |
| 6/24/16 | 3.486 | 7.176 |
| 6/27/16 | 3.438 | 7.337 |
| 6/28/16 | 3.412 | 7.263 |
| 6/29/16 | 3.384 | 7.135 |
| 6/30/16 | 3.381 | 7.047 |
| 7/1/16 | 3.331 | 6.811 |
| 7/5/16 | 3.272 | 6.808 |
| 7/6/16 | 3.262 | 6.83 |
| 7/7/16 | 3.248 | 6.752 |
| 7/8/16 | 3.215 | 6.66 |
| 7/11/16 | 3.215 | 6.521 |
| 7/12/16 | 3.256 | 6.4 |
| 7/13/16 | 3.231 | 6.458 |
| 7/14/16 | 3.264 | 6.364 |
| 7/15/16 | 3.299 | 6.415 |
| 7/18/16 | 3.303 | 6.424 |
| 7/19/16 | 3.289 | 6.431 |
| 7/20/16 | 3.3 | 6.411 |
| 7/21/16 | 3.295 | 6.394 |
| 7/22/16 | 3.282 | 6.4 |
| 7/25/16 | 3.297 | 6.401 |
| 7/26/16 | 3.318 | 6.458 |
| 7/27/16 | 3.3 | 6.461 |
| 7/28/16 | 3.296 | 6.496 |
| 7/29/16 | 3.266 | 6.535 |
| 8/1/16 | 3.285 | 6.628 |
| 8/2/16 | 3.334 | 6.681 |
| 8/3/16 | 3.338 | 6.65 |
| 8/4/16 | 3.284 | 6.56 |
| 8/5/16 | 3.315 | 6.486 |
| 8/8/16 | 3.313 | 6.441 |
| 8/9/16 | 3.287 | 6.367 |
| 8/10/16 | 3.248 | 6.354 |
| 8/11/16 | 3.271 | 6.362 |
| 8/12/16 | 3.24 | 6.326 |
| 8/15/16 | 3.263 | 6.288 |
| 8/16/16 | 3.259 | 6.267 |
| 8/17/16 | 3.26 | 6.296 |
| 8/18/16 | 3.236 | 6.28 |
| 8/19/16 | 3.255 | 6.268 |
| 8/22/16 | 3.229 | 6.276 |
| 8/23/16 | 3.212 | 6.264 |
| 8/24/16 | 3.224 | 6.263 |
| 8/25/16 | 3.242 | 6.293 |
| 8/26/16 | 3.249 | 6.278 |
| 8/29/16 | 3.246 | 6.274 |
| 8/30/16 | 3.239 | 6.262 |
| 8/31/16 | 3.244 | 6.278 |
| 9/1/16 | 3.252 | 6.279 |
| 9/2/16 | 3.266 | 6.241 |
| 9/6/16 | 3.246 | 6.22 |
| 9/7/16 | 3.238 | 6.185 |
| 9/8/16 | 3.291 | 6.196 |
| 9/9/16 | 3.365 | 6.294 |
| 9/12/16 | 3.388 | 6.355 |
| 9/13/16 | 3.427 | 6.416 |
| 9/14/16 | 3.414 | 6.429 |
| 9/15/16 | 3.422 | 6.44 |
| 9/16/16 | 3.409 | 6.426 |
| 9/19/16 | 3.417 | 6.426 |
| 9/20/16 | 3.383 | 6.298 |
| 9/21/16 | 3.405 | 6.361 |
| 9/22/16 | 3.327 | 6.222 |
| 9/23/16 | 3.316 | 6.23 |
| 9/26/16 | 3.309 | 6.256 |
| 9/27/16 | 3.3 | 6.274 |
| 9/28/16 | 3.291 | 6.349 |
| 9/29/16 | 3.297 | 6.344 |
| 9/30/16 | 3.47 | 6.314 |
| 10/3/16 | 3.307 | 6.186 |
| 10/4/16 | 3.338 | 6.172 |
| 10/5/16 | 3.37 | 6.154 |
| 10/6/16 | 3.371 | 6.309 |
| 10/7/16 | 3.368 | 6.399 |
| 10/10/16 | 3.369 | 6.385 |
| 10/11/16 | 3.391 | 6.401 |
| 10/12/16 | 3.397 | 6.403 |
| 10/13/16 | 3.364 | 6.426 |
| 10/14/16 | 3.382 | 6.386 |
| 10/17/16 | 3.371 | 6.38 |
| 10/18/16 | 3.352 | 6.345 |
| 10/19/16 | 3.339 | 6.292 |
| 10/20/16 | 3.341 | 6.274 |
| 10/21/16 | 3.351 | 6.273 |
| 10/24/16 | 3.368 | 6.263 |
| 10/25/16 | 3.382 | 6.272 |
| 10/26/16 | 3.418 | 6.329 |
| 10/27/16 | 3.463 | 6.38 |
| 10/28/16 | 3.499 | 6.43 |
| 10/31/16 | 3.471 | 6.493 |
| 11/1/16 | 3.478 | 6.347 |
| 11/2/16 | 3.466 | 6.45 |
| 11/3/16 | 3.506 | 6.448 |
| 11/4/16 | 3.483 | 6.46 |
| 11/7/16 | 3.491 | 6.343 |
| 11/8/16 | 3.509 | 6.318 |
| 11/9/16 | 3.612 | 6.416 |
| 11/10/16 | 3.655 | 6.507 |
| 11/11/16 | 3.654 | 6.513 |
| 11/14/16 | 3.782 | 6.752 |
| 11/15/16 | 3.776 | 6.634 |
| 11/16/16 | 3.783 | 6.612 |
| 11/17/16 | 3.813 | 6.576 |
| 11/18/16 | 3.876 | 6.604 |
| 11/21/16 | 3.878 | 6.584 |
| 11/22/16 | 3.88 | 6.572 |
| 11/23/16 | 3.921 | 6.634 |
| 11/25/16 | 3.93 | 6.532 |
| 11/28/16 | 3.88 | 6.731 |
| 11/29/16 | 3.905 | 6.701 |
| 11/30/16 | 3.894 | 6.726 |
| 12/1/16 | 3.919 | 6.619 |
| 12/2/16 | 3.86 | 6.72 |
| 12/5/16 | 3.88 | 6.678 |
| 12/6/16 | 3.867 | 6.622 |
| 12/7/16 | 3.826 | 6.51 |
| 12/8/16 | 3.847 | 6.491 |
| 12/9/16 | 3.998 | 6.465 |
| 12/12/16 | 4.011 | 6.445 |
| 12/13/16 | 3.917 | 6.427 |
| 12/14/16 | 3.889 | 6.421 |
| 12/15/16 | 3.963 | 6.527 |
| 12/16/16 | 3.961 | 6.529 |
| 12/19/16 | 3.951 | 6.524 |
| 12/20/16 | 3.96 | 6.515 |
| 12/21/16 | 3.93 | 6.498 |
| 12/22/16 | 3.93 | 6.47 |
| 12/23/16 | 3.91 | 6.451 |
| 12/27/16 | 3.932 | 6.475 |
| 12/28/16 | 3.906 | 6.417 |
| 12/29/16 | 3.861 | 6.401 |
| 12/30/16 | 3.844 | 6.409 |
| 1/3/17 | 3.813 | 6.187 |
| 1/4/17 | 3.787 | 6.118 |
| 1/5/17 | 3.738 | 6.052 |
| 1/6/17 | 3.764 | 6.062 |
| 1/9/17 | 3.748 | 6.163 |
| 1/10/17 | 3.757 | 6.152 |
| 1/11/17 | 3.756 | 6.168 |
| 1/12/17 | 3.736 | 6.164 |
| 1/13/17 | 3.777 | 6.15 |
| 1/17/17 | 3.731 | 6.195 |
| 1/18/17 | 3.771 | 6.212 |
| 1/19/17 | 3.825 | 6.249 |
| 1/20/17 | 3.842 | 6.269 |
| 1/23/17 | 3.787 | 6.294 |
| 1/24/17 | 3.812 | 6.246 |
| 1/25/17 | 3.851 | 6.217 |
| 1/26/17 | 3.852 | 6.191 |
| 1/27/17 | 3.828 | 6.175 |
| 1/30/17 | 3.844 | 6.199 |
| 1/31/17 | 3.83 | 6.198 |
| 2/1/17 | 3.822 | 6 |
| 2/2/17 | 3.794 | 5.98 |
| 2/3/17 | 3.778 | 5.93 |
| 2/6/17 | 3.756 | 5.914 |
| 2/7/17 | 3.742 | 5.92 |
| 2/8/17 | 3.718 | 5.972 |
| 2/9/17 | 3.745 | 5.966 |
| 2/10/17 | 3.758 | 5.919 |
| 2/13/17 | 3.767 | 5.901 |
| 2/14/17 | 3.791 | 5.894 |
| 2/15/17 | 3.809 | 6.036 |
| 2/16/17 | 3.768 | 6.159 |
| 2/17/17 | 3.746 | 6.018 |
| 2/21/17 | 3.747 | 5.975 |
| 2/22/17 | 3.75 | 5.952 |
| 2/23/17 | 3.76 | 5.918 |
| 2/24/17 | 3.726 | 5.923 |
| 2/27/17 | 3.737 | 5.908 |
| 2/28/17 | 3.738 | 5.911 |
| 3/1/17 | 3.75 | 5.725 |
| 3/2/17 | 3.761 | 5.743 |
| 3/3/17 | 3.762 | 5.776 |
| 3/6/17 | 3.768 | 5.827 |
| 3/7/17 | 3.8 | 5.896 |
| 3/8/17 | 3.867 | 5.997 |
| 3/9/17 | 3.907 | 6.125 |
| 3/10/17 | 3.898 | 6.09 |
| 3/13/17 | 3.927 | 6.14 |
| 3/14/17 | 3.927 | 6.219 |
| 3/15/17 | 3.897 | 6.151 |
| 3/16/17 | 3.865 | 6.009 |
| 3/17/17 | 3.842 | 6.021 |
| 3/20/17 | 3.824 | 6.056 |
| 3/21/17 | 3.792 | 6.09 |
| 3/22/17 | 3.771 | 6.325 |
| 3/23/17 | 3.781 | 6.296 |
| 3/24/17 | 3.766 | 6.255 |
| 3/27/17 | 3.749 | 6.272 |
| 3/28/17 | 3.76 | 6.213 |
| 3/29/17 | 3.747 | 6.188 |
| 3/30/17 | 3.763 | 6.125 |
| 3/31/17 | 3.764 | 6.115 |
| 4/3/17 | 3.676 | 5.676 |
| 4/4/17 | 3.677 | 5.683 |
| 4/5/17 | 3.677 | 5.635 |
| 4/6/17 | 3.677 | 5.679 |
| 4/7/17 | 3.67 | 5.666 |
| 4/10/17 | 3.681 | 5.664 |
| 4/11/17 | 3.644 | 5.653 |
| 4/12/17 | 3.625 | 5.675 |
| 4/13/17 | 3.581 | 5.674 |
| 4/17/17 | 3.599 | 5.685 |
| 4/18/17 | 3.567 | 5.702 |
| 4/19/17 | 3.577 | 5.684 |
| 4/20/17 | 3.605 | 5.684 |
| 4/21/17 | 3.588 | 5.67 |
| 4/24/17 | 3.625 | 5.647 |
| 4/25/17 | 3.647 | 5.632 |
| 4/26/17 | 3.652 | 5.618 |
| 4/27/17 | 3.63 | 5.616 |
| 4/28/17 | 3.63 | 5.967 |
| 5/1/17 | 3.646 | 5.903 |
| 5/2/17 | 3.635 | 5.873 |
| 5/3/17 | 3.621 | 5.874 |
| 5/4/17 | 3.666 | 5.947 |
| 5/5/17 | 3.661 | 5.966 |
| 5/8/17 | 3.671 | 5.96 |
| 5/9/17 | 3.691 | 5.967 |
| 5/10/17 | 3.672 | 5.951 |
| 5/11/17 | 3.672 | 5.942 |
| 5/12/17 | 3.624 | 5.89 |
| 5/15/17 | 3.618 | 5.918 |
| 5/16/17 | 3.607 | 5.882 |
| 5/17/17 | 3.553 | 5.896 |
| 5/18/17 | 3.552 | 5.961 |
| 5/19/17 | 3.556 | 5.9 |
| 5/22/17 | 3.554 | 5.882 |
| 5/23/17 | 3.582 | 5.882 |
| 5/24/17 | 3.59 | 5.888 |
| 5/25/17 | 3.584 | 5.872 |
| 5/26/17 | 3.565 | 5.85 |
| 5/30/17 | 3.55 | 5.836 |
| 5/31/17 | 3.54 | 5.842 |
| 6/1/17 | 3.544 | 5.45 |
| 6/2/17 | 3.498 | 5.414 |
| 6/5/17 | 3.505 | 5.426 |
| 6/6/17 | 3.481 | 5.432 |
| 6/7/17 | 3.499 | 5.451 |
| 6/8/17 | 3.524 | 5.488 |
| 6/9/17 | 3.537 | 5.498 |
| 6/12/17 | 3.537 | 5.496 |
| 6/13/17 | 3.546 | 5.472 |
| 6/14/17 | 3.485 | 5.449 |
| 6/15/17 | 3.481 | 5.482 |
| 6/16/17 | 3.497 | 5.498 |
| 6/19/17 | 3.498 | 5.503 |
| 6/20/17 | 3.485 | 5.551 |
| 6/21/17 | 3.501 | 5.596 |
| 6/22/17 | 3.494 | 5.618 |
| 6/23/17 | 3.49 | 5.602 |
| 6/26/17 | 3.469 | 5.569 |
| 6/27/17 | 3.514 | 5.582 |
| 6/28/17 | 3.522 | 5.575 |
| 6/29/17 | 3.542 | 5.577 |
| 6/30/17 | 3.545 | 5.644 |
| 7/3/17 | 3.555 | 5.574 |
| 7/5/17 | 3.568 | 5.59 |
| 7/6/17 | 3.588 | 5.633 |
| 7/7/17 | 3.598 | 5.665 |
| 7/10/17 | 3.581 | 5.776 |
| 7/11/17 | 3.581 | 5.773 |
| 7/12/17 | 3.54 | 5.592 |
| 7/13/17 | 3.555 | 5.59 |
| 7/14/17 | 3.528 | 5.704 |
| 7/17/17 | 3.52 | 5.663 |
| 7/18/17 | 3.486 | 5.643 |
| 7/19/17 | 3.478 | 5.618 |
| 7/20/17 | 3.462 | 5.593 |
| 7/21/17 | 3.445 | 5.596 |
| 7/24/17 | 3.461 | 5.603 |
| 7/25/17 | 3.517 | 5.611 |
| 7/26/17 | 3.505 | 5.586 |
| 7/27/17 | 3.506 | 5.591 |
| 7/28/17 | 3.491 | 5.585 |
| 7/31/17 | 3.49 | 5.599 |
| 8/1/17 | 3.467 | 5.586 |
| 8/2/17 | 3.465 | 5.591 |
| 8/3/17 | 3.458 | 5.593 |
| 8/4/17 | 3.488 | 5.629 |
| 8/7/17 | 3.493 | 5.623 |
| 8/8/17 | 3.519 | 5.66 |
| 8/9/17 | 3.522 | 5.738 |
| 8/10/17 | 3.531 | 5.799 |
| 8/11/17 | 3.533 | 5.836 |
| 8/14/17 | 3.521 | 5.81 |
| 8/15/17 | 3.539 | 5.8 |
| 8/16/17 | 3.522 | 5.786 |
| 8/17/17 | 3.506 | 6.195 |
| 8/18/17 | 3.501 | 6.219 |
| 8/21/17 | 3.502 | 6.211 |
| 8/22/17 | 3.514 | 6.196 |
| 8/23/17 | 3.496 | 6.192 |
| 8/24/17 | 3.498 | 6.174 |
| 8/25/17 | 3.551 | 6.16 |
| 8/28/17 | 3.554 | 6.162 |
| 8/29/17 | 3.525 | 6.145 |
| 8/30/17 | 3.545 | 6.133 |
| 8/31/17 | 3.532 | 6.088 |
| 9/1/17 | 3.455 | 5.375 |
| 9/5/17 | 3.428 | 5.357 |
| 9/6/17 | 3.433 | 5.362 |
| 9/7/17 | 3.416 | 5.367 |
| 9/8/17 | 3.434 | 5.384 |
| 9/11/17 | 3.476 | 5.399 |
| 9/12/17 | 3.506 | 5.399 |
| 9/13/17 | 3.498 | 5.388 |
| 9/14/17 | 3.507 | 5.383 |
| 9/15/17 | 3.504 | 5.372 |
| 9/18/17 | 3.486 | 5.366 |
| 9/19/17 | 3.531 | 5.361 |
| 9/20/17 | 3.496 | 5.362 |
| 9/21/17 | 3.571 | 5.392 |
| 9/22/17 | 3.564 | 5.37 |
| 9/25/17 | 3.541 | 5.386 |
| 9/26/17 | 3.54 | 5.378 |
| 9/27/17 | 3.579 | 5.427 |
| 9/28/17 | 3.574 | 5.425 |
| 9/29/17 | 3.554 | 5.391 |
| 10/2/17 | 3.547 | 5.399 |
| 10/3/17 | 3.537 | 5.331 |
| 10/4/17 | 3.544 | 5.327 |
| 10/5/17 | 3.552 | 5.319 |
| 10/6/17 | 3.57 | 5.432 |
| 10/9/17 | 3.566 | 5.428 |
| 10/10/17 | 3.554 | 5.428 |
| 10/11/17 | 3.56 | 5.427 |
| 10/12/17 | 3.562 | 5.442 |
| 10/13/17 | 3.528 | 5.654 |
| 10/16/17 | 3.536 | 5.65 |
| 10/17/17 | 3.544 | 5.641 |
| 10/18/17 | 3.565 | 5.635 |
| 10/19/17 | 3.549 | 5.621 |
| 10/20/17 | 3.576 | 5.622 |
| 10/23/17 | 3.568 | 5.618 |
| 10/24/17 | 3.592 | 5.631 |
| 10/25/17 | 3.625 | 5.674 |
| 10/26/17 | 3.627 | 5.676 |
| 10/27/17 | 3.616 | 5.687 |
| 10/30/17 | 3.584 | 5.691 |
| 10/31/17 | 3.593 | 5.683 |
| 11/1/17 | 3.55 | 5.35 |
| 11/2/17 | 3.552 | 5.358 |
| 11/3/17 | 3.558 | 5.358 |
| 11/6/17 | 3.556 | 5.381 |
| 11/7/17 | 3.57 | 5.414 |
| 11/8/17 | 3.578 | 5.474 |
| 11/9/17 | 3.608 | 5.55 |
| 11/10/17 | 3.641 | 5.555 |
| 11/13/17 | 3.688 | 5.85 |
| 11/14/17 | 3.686 | 5.715 |
| 11/15/17 | 3.654 | 5.755 |
| 11/16/17 | 3.721 | 5.664 |
| 11/17/17 | 3.703 | 5.643 |
| 11/20/17 | 3.711 | 5.639 |
| 11/21/17 | 3.69 | 5.614 |
| 11/22/17 | 3.725 | 5.598 |
| 11/24/17 | 3.693 | 5.571 |
| 11/27/17 | 3.667 | 5.578 |
| 11/28/17 | 3.696 | 5.578 |
| 11/29/17 | 3.689 | 5.578 |
| 11/30/17 | 3.702 | 5.586 |
| 12/1/17 | 3.611 | 5.504 |
| 12/4/17 | 3.598 | 5.502 |
| 12/5/17 | 3.581 | 5.494 |
| 12/6/17 | 3.553 | 5.5 |
| 12/7/17 | 3.573 | 5.527 |
| 12/8/17 | 3.597 | 5.534 |
| 12/11/17 | 3.594 | 5.555 |
| 12/12/17 | 3.61 | 5.533 |
| 12/13/17 | 3.583 | 5.517 |
| 12/14/17 | 3.56 | 5.525 |
| 12/15/17 | 3.554 | 5.531 |
| 12/18/17 | 3.572 | 5.548 |
| 12/19/17 | 3.621 | 5.562 |
| 12/20/17 | 3.652 | 5.74 |
| 12/21/17 | 3.643 | 5.738 |
| 12/22/17 | 3.643 | 5.751 |
| 12/26/17 | 3.632 | 5.728 |
| 12/27/17 | 3.59 | 5.736 |
| 12/28/17 | 3.576 | 5.709 |
| 12/29/17 | 3.568 | 5.822 |